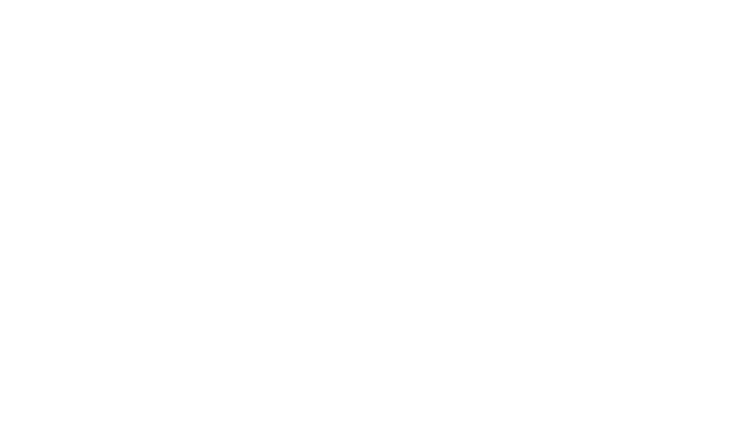
| Category | Series 0 | Series 1 | Series 2 |
|---|---|---|---|
| 0.0 | 853.707 | 300 | 2859.454 |
| 10.0 | 853.707 | 300 | 2859.454 |
| 90.0 | 1279.854 | 300 | 2433.306 |
| 100.0 | 1279.854 | 300 | 2433.306 |